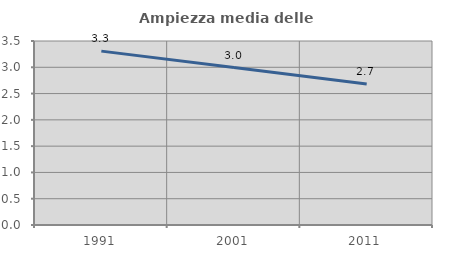
| Category | Ampiezza media delle famiglie |
|---|---|
| 1991.0 | 3.308 |
| 2001.0 | 2.995 |
| 2011.0 | 2.683 |